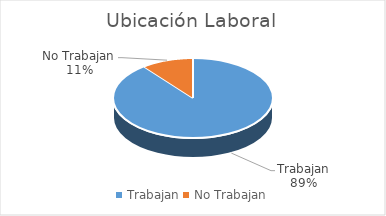
| Category | Series 0 |
|---|---|
| Trabajan | 34 |
| No Trabajan | 4 |